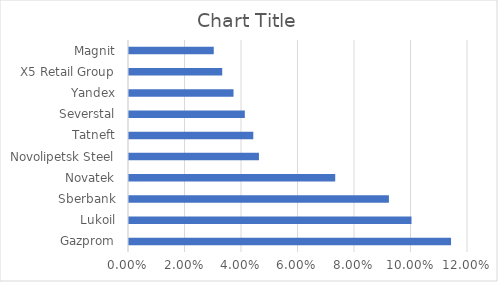
| Category | Series 0 |
|---|---|
| Gazprom | 0.114 |
| Lukoil | 0.1 |
| Sberbank | 0.092 |
| Novatek | 0.073 |
| Novolipetsk Steel | 0.046 |
| Tatneft | 0.044 |
| Severstal | 0.041 |
| Yandex | 0.037 |
| X5 Retail Group | 0.033 |
| Magnit | 0.03 |